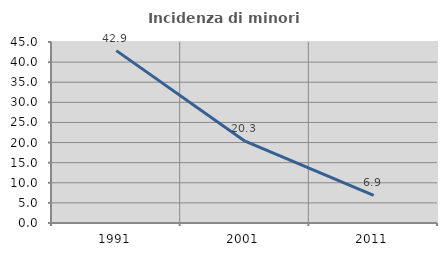
| Category | Incidenza di minori stranieri |
|---|---|
| 1991.0 | 42.857 |
| 2001.0 | 20.339 |
| 2011.0 | 6.863 |